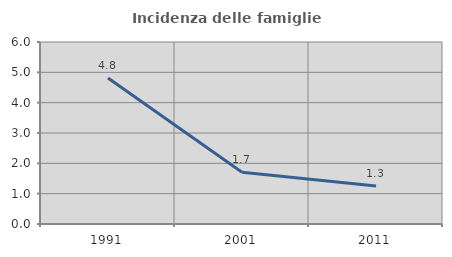
| Category | Incidenza delle famiglie numerose |
|---|---|
| 1991.0 | 4.812 |
| 2001.0 | 1.708 |
| 2011.0 | 1.255 |